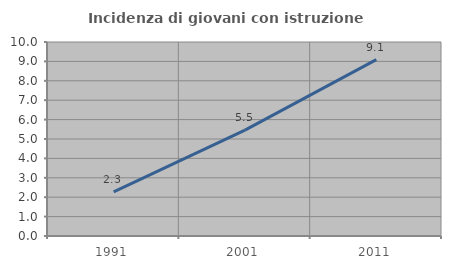
| Category | Incidenza di giovani con istruzione universitaria |
|---|---|
| 1991.0 | 2.273 |
| 2001.0 | 5.455 |
| 2011.0 | 9.091 |